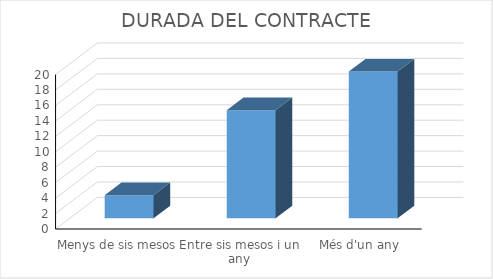
| Category | Series 0 |
|---|---|
| Menys de sis mesos | 3 |
| Entre sis mesos i un any | 14 |
| Més d'un any | 19 |